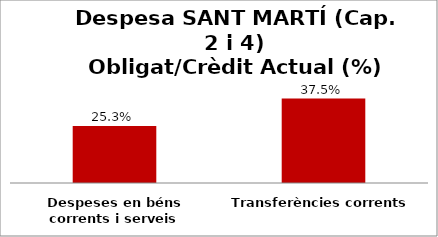
| Category | Series 0 |
|---|---|
| Despeses en béns corrents i serveis | 0.253 |
| Transferències corrents | 0.375 |